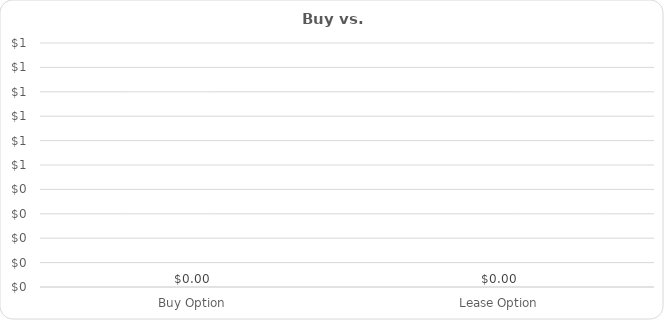
| Category | Series 0 |
|---|---|
| Buy Option | 0 |
| Lease Option | 0 |